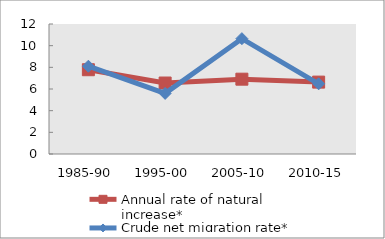
| Category | Annual rate of natural increase* | Crude net migration rate* |
|---|---|---|
| 1985-90 | 7.779 | 8.103 |
| 1995-00 | 6.551 | 5.595 |
| 2005-10 | 6.906 | 10.648 |
| 2010-15 | 6.636 | 6.476 |